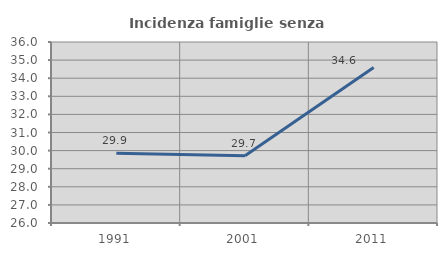
| Category | Incidenza famiglie senza nuclei |
|---|---|
| 1991.0 | 29.858 |
| 2001.0 | 29.711 |
| 2011.0 | 34.586 |